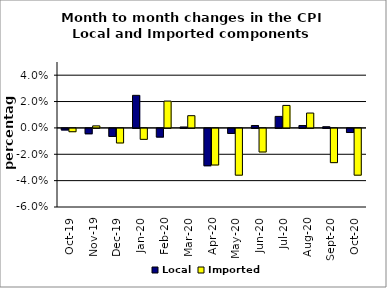
| Category | Local | Imported |
|---|---|---|
| 2019-10-01 | -0.001 | -0.003 |
| 2019-11-01 | -0.004 | 0.002 |
| 2019-12-01 | -0.006 | -0.011 |
| 2020-01-01 | 0.025 | -0.008 |
| 2020-02-01 | -0.007 | 0.02 |
| 2020-03-01 | 0.001 | 0.009 |
| 2020-04-01 | -0.028 | -0.028 |
| 2020-05-01 | -0.004 | -0.035 |
| 2020-06-01 | 0.002 | -0.018 |
| 2020-07-01 | 0.009 | 0.017 |
| 2020-08-01 | 0.002 | 0.011 |
| 2020-09-01 | 0.001 | -0.026 |
| 2020-10-01 | -0.003 | -0.035 |